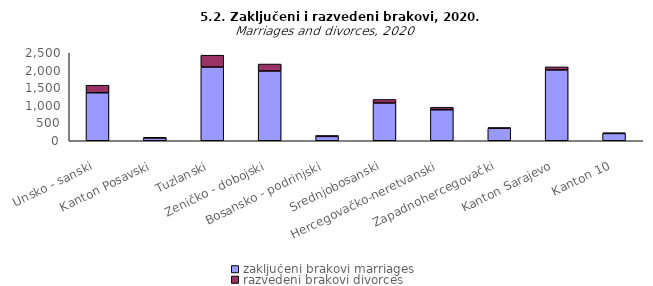
| Category | zaključeni brakovi marriages | razvedeni brakovi divorces |
|---|---|---|
| Unsko - sanski | 1364 | 214 |
| Kanton Posavski | 78 | 19 |
| Tuzlanski | 2093 | 338 |
| Zeničko - dobojski | 1981 | 199 |
| Bosansko - podrinjski | 124 | 24 |
| Srednjobosanski | 1073 | 100 |
| Hercegovačko-neretvanski | 881 | 68 |
| Zapadnohercegovački | 354 | 20 |
| Kanton Sarajevo | 2012 | 87 |
| Kanton 10 | 209 | 14 |